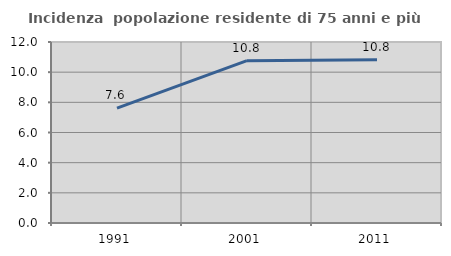
| Category | Incidenza  popolazione residente di 75 anni e più |
|---|---|
| 1991.0 | 7.612 |
| 2001.0 | 10.76 |
| 2011.0 | 10.822 |